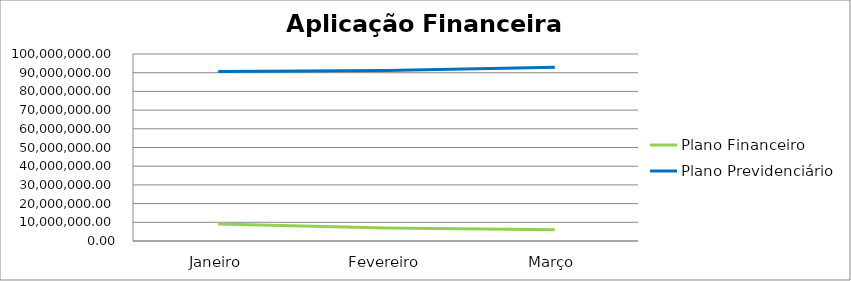
| Category | Plano Financeiro | Plano Previdenciário |
|---|---|---|
| Janeiro | 9042848.22 | 90685400.49 |
| Fevereiro | 7009964.55 | 91183139.06 |
| Março | 5999673.19 | 92947992.78 |